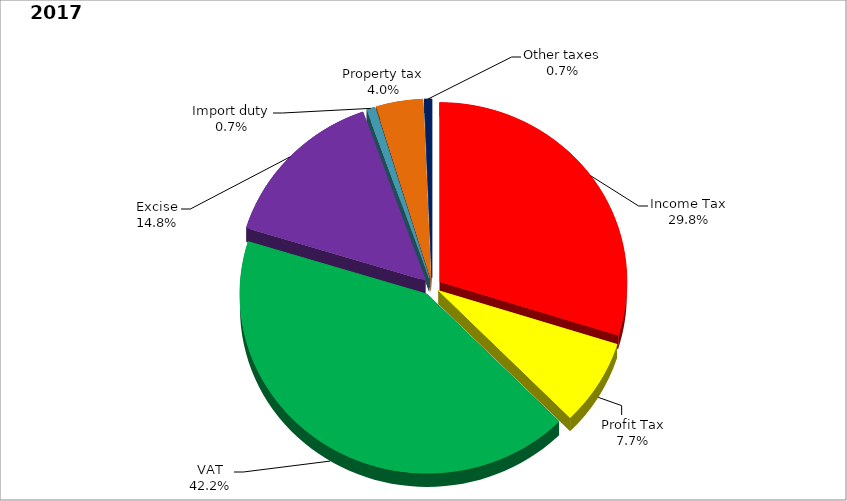
| Category | Series 0 |
|---|---|
| Income Tax | 0.298 |
| Profit Tax | 0.077 |
| VAT | 0.422 |
| Excise | 0.148 |
| Import duty | 0.007 |
| Property tax | 0.04 |
| Other taxes | 0.007 |